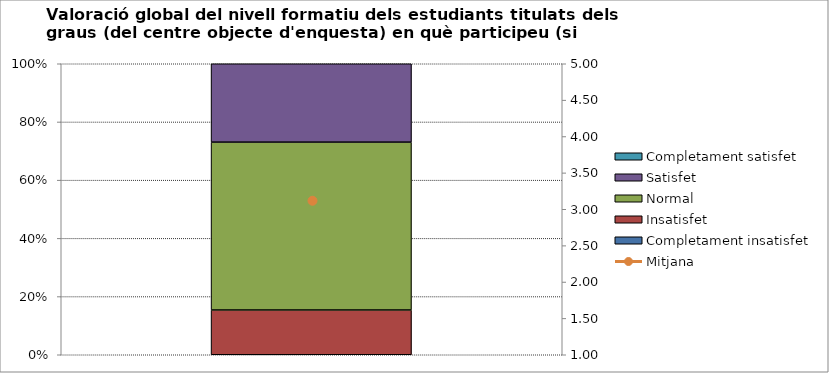
| Category | Completament insatisfet | Insatisfet | Normal | Satisfet | Completament satisfet |
|---|---|---|---|---|---|
| 0 | 0 | 4 | 15 | 7 | 0 |